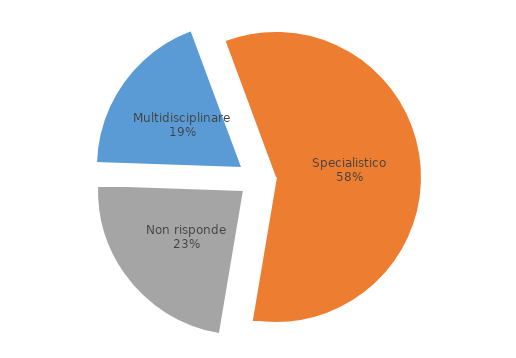
| Category | Series 0 |
|---|---|
| Multidisciplinare | 18.8 |
| Specialistico | 58.3 |
| Non risponde | 22.9 |